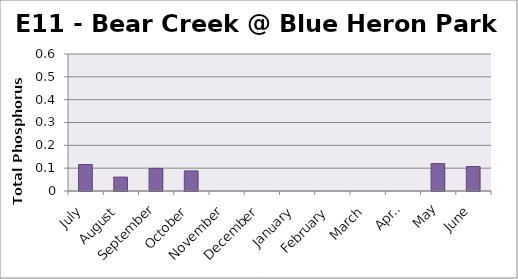
| Category | Phosphorus (mg/L) |
|---|---|
| July | 0.116 |
| August | 0.061 |
| September | 0.099 |
| October | 0.088 |
| November | 0 |
| December | 0 |
| January | 0 |
| February | 0 |
| March | 0 |
| April | 0 |
| May | 0.12 |
| June | 0.107 |